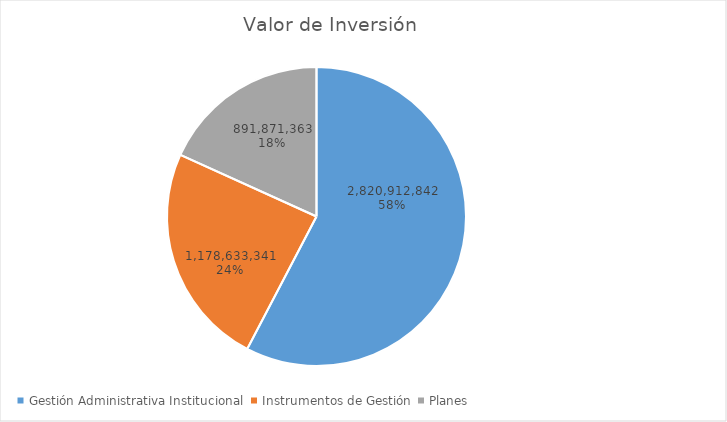
| Category | Valor de Inversión | Porcentaje de Ejecución dentro de la Actividad |
|---|---|---|
| Gestión Administrativa Institucional | 2820912842 | 9 |
| Instrumentos de Gestión | 1178633341 | 8 |
| Planes | 891871363 | 8 |